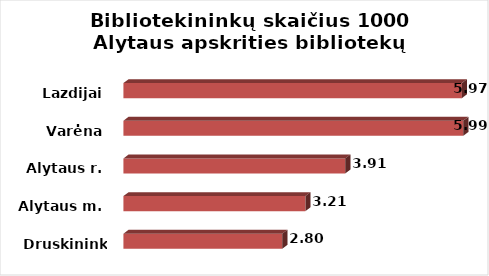
| Category | Series 0 |
|---|---|
| Druskininkai | 2.8 |
| Alytaus m. | 3.208 |
| Alytaus r. | 3.91 |
| Varėna | 5.99 |
| Lazdijai | 5.965 |